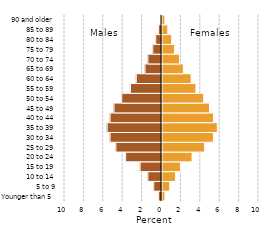
| Category | Series 0 |
|---|---|
| Younger than 5 | 0.3 |
| 5 to 9 | 0.8 |
| 10 to 14 | 1.4 |
| 15 to 19 | 1.9 |
| 20 to 24 | 3.1 |
| 25 to 29 | 4.4 |
| 30 to 34 | 5.3 |
| 35 to 39 | 5.7 |
| 40 to 44 | 5.3 |
| 45 to 49 | 4.9 |
| 50 to 54 | 4.3 |
| 55 to 59 | 3.5 |
| 60 to 64 | 3 |
| 65 to 69 | 2.2 |
| 70 to 74 | 1.8 |
| 75 to 79 | 1.3 |
| 80 to 84 | 1 |
| 85 to 89 | 0.6 |
| 90 and older | 0.3 |